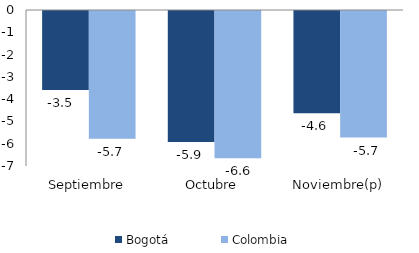
| Category | Bogotá | Colombia |
|---|---|---|
| Septiembre | -3.54 | -5.737 |
| Octubre | -5.879 | -6.607 |
| Noviembre(p) | -4.59 | -5.681 |